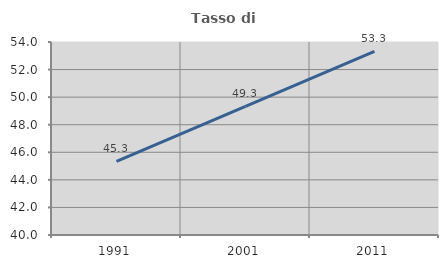
| Category | Tasso di occupazione   |
|---|---|
| 1991.0 | 45.337 |
| 2001.0 | 49.332 |
| 2011.0 | 53.318 |